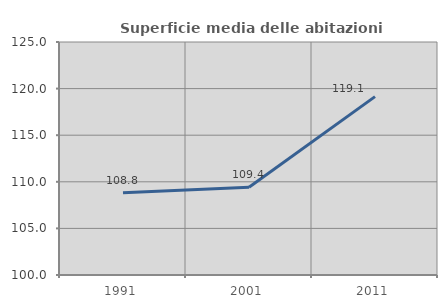
| Category | Superficie media delle abitazioni occupate |
|---|---|
| 1991.0 | 108.835 |
| 2001.0 | 109.422 |
| 2011.0 | 119.141 |